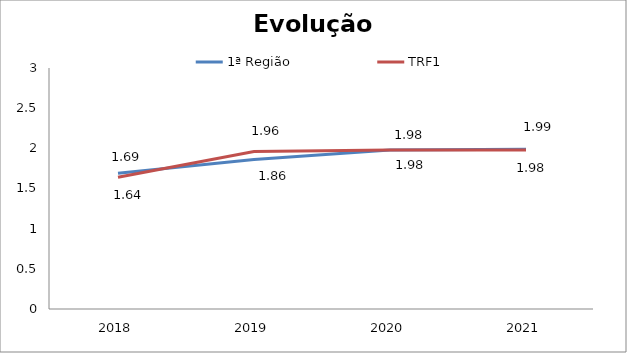
| Category | 1ª Região | TRF1 |
|---|---|---|
| 0 | 1.69 | 1.64 |
| 1 | 1.86 | 1.96 |
| 2 | 1.98 | 1.98 |
| 3 | 1.99 | 1.98 |